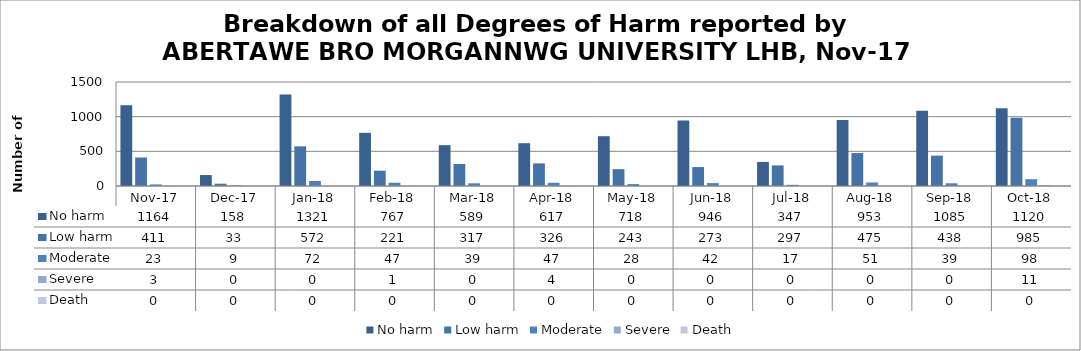
| Category | No harm | Low harm | Moderate | Severe | Death |
|---|---|---|---|---|---|
| Nov-17 | 1164 | 411 | 23 | 3 | 0 |
| Dec-17 | 158 | 33 | 9 | 0 | 0 |
| Jan-18 | 1321 | 572 | 72 | 0 | 0 |
| Feb-18 | 767 | 221 | 47 | 1 | 0 |
| Mar-18 | 589 | 317 | 39 | 0 | 0 |
| Apr-18 | 617 | 326 | 47 | 4 | 0 |
| May-18 | 718 | 243 | 28 | 0 | 0 |
| Jun-18 | 946 | 273 | 42 | 0 | 0 |
| Jul-18 | 347 | 297 | 17 | 0 | 0 |
| Aug-18 | 953 | 475 | 51 | 0 | 0 |
| Sep-18 | 1085 | 438 | 39 | 0 | 0 |
| Oct-18 | 1120 | 985 | 98 | 11 | 0 |